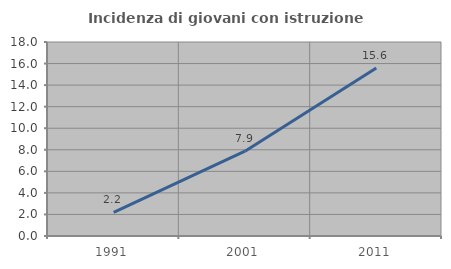
| Category | Incidenza di giovani con istruzione universitaria |
|---|---|
| 1991.0 | 2.198 |
| 2001.0 | 7.865 |
| 2011.0 | 15.584 |